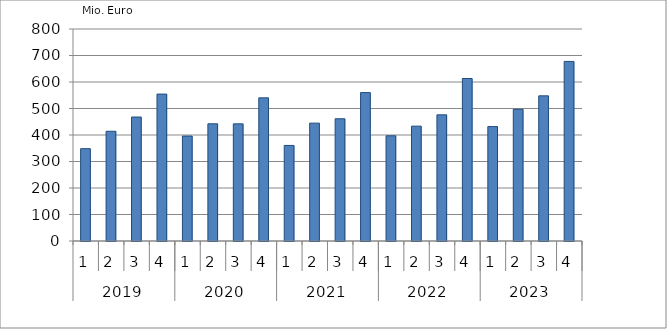
| Category | Ausbaugewerblicher Umsatz3 |
|---|---|
| 0 | 348466.115 |
| 1 | 414145.554 |
| 2 | 467849.207 |
| 3 | 554369.34 |
| 4 | 395996.128 |
| 5 | 442270.528 |
| 6 | 441987.109 |
| 7 | 540250.513 |
| 8 | 360578.959 |
| 9 | 444796.964 |
| 10 | 461290.095 |
| 11 | 559989.337 |
| 12 | 396959.135 |
| 13 | 433420.546 |
| 14 | 476099.112 |
| 15 | 613244.901 |
| 16 | 431755.233 |
| 17 | 497030.878 |
| 18 | 547817.6 |
| 19 | 677619.257 |